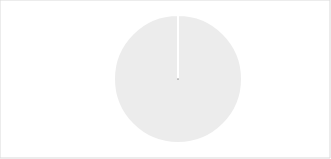
| Category | Iceland, Greenland and Faroes |
|---|---|
| 0 | 967.146 |